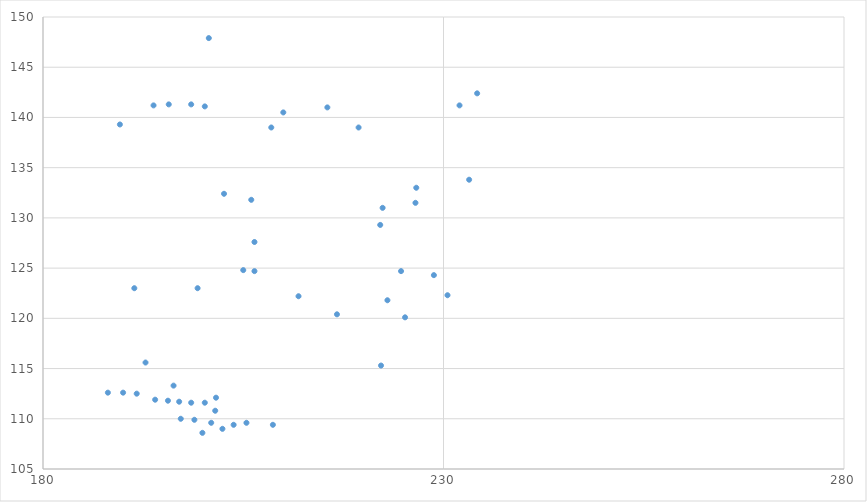
| Category | y(mm) |
|---|---|
| 198.9 | 109.9 |
| 201.0 | 109.6 |
| 205.4 | 109.6 |
| 197.2 | 110 |
| 208.7 | 109.4 |
| 197.0 | 111.7 |
| 191.7 | 112.5 |
| 188.1 | 112.6 |
| 190.0 | 112.6 |
| 198.5 | 111.6 |
| 200.2 | 111.6 |
| 192.8 | 115.6 |
| 222.2 | 115.3 |
| 216.7 | 120.4 |
| 191.4 | 123 |
| 225.2 | 120.1 |
| 223.0 | 121.8 |
| 199.3 | 123 |
| 211.9 | 122.2 |
| 230.5 | 122.3 |
| 228.8 | 124.3 |
| 224.7 | 124.7 |
| 206.4 | 127.6 |
| 222.1 | 129.3 |
| 202.6 | 132.4 |
| 206.0 | 131.8 |
| 222.4 | 131 |
| 226.5 | 131.5 |
| 233.2 | 133.8 |
| 226.6 | 133 |
| 189.6 | 139.3 |
| 208.5 | 139 |
| 219.4 | 139 |
| 193.8 | 141.2 |
| 195.7 | 141.3 |
| 210.0 | 140.5 |
| 198.5 | 141.3 |
| 215.5 | 141 |
| 232.0 | 141.2 |
| 234.2 | 142.4 |
| 200.7 | 147.9 |
| 200.2 | 141.1 |
| 205.0 | 124.8 |
| 206.4 | 124.7 |
| 194.0 | 111.9 |
| 195.6 | 111.8 |
| 196.3 | 113.3 |
| 203.8 | 109.4 |
| 202.4 | 109 |
| 201.6 | 112.1 |
| 201.5 | 110.8 |
| 199.9 | 108.6 |